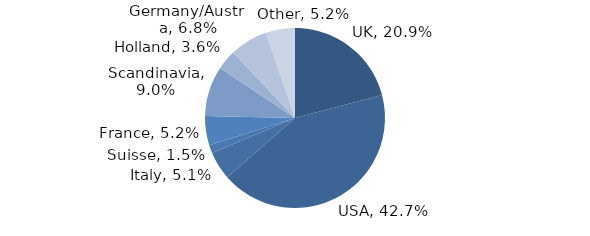
| Category | Investment Style |
|---|---|
| UK | 0.209 |
| USA | 0.427 |
| Italy | 0.051 |
| Suisse | 0.015 |
| France | 0.052 |
| Scandinavia | 0.09 |
| Holland | 0.036 |
| Germany/Austria | 0.068 |
| Other | 0.052 |